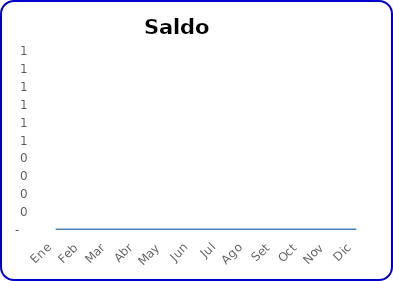
| Category | saldo |
|---|---|
| Ene | 0 |
| Feb | 0 |
| Mar | 0 |
| Abr | 0 |
| May | 0 |
| Jun | 0 |
| Jul | 0 |
| Ago | 0 |
| Set | 0 |
| Oct | 0 |
| Nov | 0 |
| Dic | 0 |